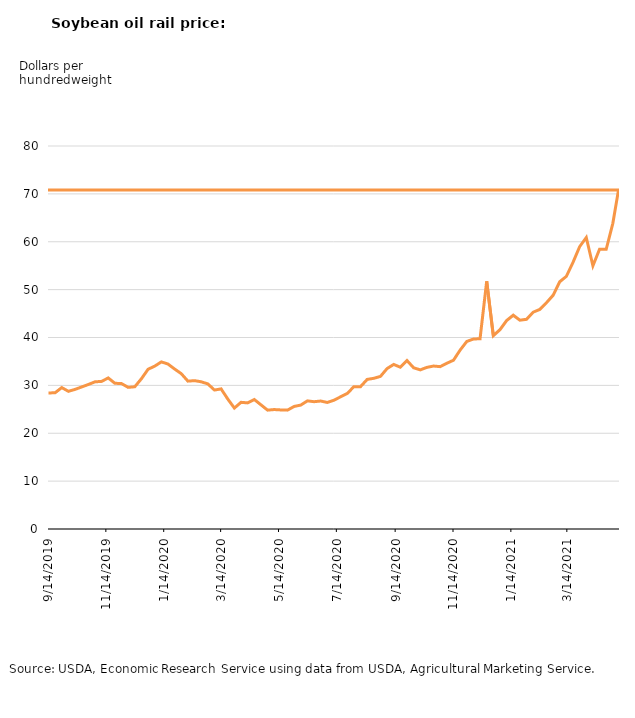
| Category | Series 0 |
|---|---|
| 9/14/19 | 28.41 |
| 9/21/19 | 28.46 |
| 9/28/19 | 29.54 |
| 10/5/19 | 28.76 |
| 10/12/19 | 29.16 |
| 10/19/19 | 29.67 |
| 10/26/19 | 30.18 |
| 11/2/19 | 30.74 |
| 11/9/19 | 30.835 |
| 11/16/19 | 31.545 |
| 11/23/19 | 30.44 |
| 11/30/19 | 30.375 |
| 12/7/19 | 29.585 |
| 12/14/19 | 29.715 |
| 12/21/19 | 31.385 |
| 12/28/19 | 33.365 |
| 1/4/20 | 34.015 |
| 1/11/20 | 34.905 |
| 1/18/20 | 34.46 |
| 1/25/20 | 33.415 |
| 2/1/20 | 32.445 |
| 2/8/20 | 30.885 |
| 2/15/20 | 30.985 |
| 2/22/20 | 30.75 |
| 2/29/20 | 30.31 |
| 3/7/20 | 29.025 |
| 3/14/20 | 29.265 |
| 3/21/20 | 27.155 |
| 3/28/20 | 25.26 |
| 4/4/20 | 26.46 |
| 4/11/20 | 26.345 |
| 4/18/20 | 27.05 |
| 4/25/20 | 25.935 |
| 5/2/20 | 24.83 |
| 5/9/20 | 24.95 |
| 5/16/20 | 24.87 |
| 5/23/20 | 24.83 |
| 5/30/20 | 25.6 |
| 6/6/20 | 25.885 |
| 6/13/20 | 26.765 |
| 6/20/20 | 26.59 |
| 6/27/20 | 26.73 |
| 7/4/20 | 26.43 |
| 7/11/20 | 26.9 |
| 7/18/20 | 27.615 |
| 7/25/20 | 28.315 |
| 8/1/20 | 29.725 |
| 8/8/20 | 29.735 |
| 8/15/20 | 31.245 |
| 8/22/20 | 31.475 |
| 8/29/20 | 31.875 |
| 9/5/20 | 33.515 |
| 9/12/20 | 34.375 |
| 9/19/20 | 33.79 |
| 9/26/20 | 35.18 |
| 10/3/20 | 33.67 |
| 10/10/20 | 33.24 |
| 10/17/20 | 33.765 |
| 10/24/20 | 34.04 |
| 10/31/20 | 33.91 |
| 11/7/20 | 34.62 |
| 11/14/20 | 35.255 |
| 11/21/20 | 37.37 |
| 11/28/20 | 39.17 |
| 12/5/20 | 39.68 |
| 12/12/20 | 39.745 |
| 12/19/20 | 51.74 |
| 12/26/20 | 40.39 |
| 1/2/21 | 41.62 |
| 1/9/21 | 43.55 |
| 1/16/21 | 44.65 |
| 1/23/21 | 43.605 |
| 1/30/21 | 43.795 |
| 2/6/21 | 45.28 |
| 2/13/21 | 45.87 |
| 2/20/21 | 47.25 |
| 2/27/21 | 48.81 |
| 3/6/21 | 51.645 |
| 3/13/21 | 52.77 |
| 3/20/21 | 55.675 |
| 3/27/21 | 58.965 |
| 4/3/21 | 60.895 |
| 4/10/21 | 54.96 |
| 4/17/21 | 58.42 |
| 4/24/21 | 58.43 |
| 5/1/21 | 63.845 |
| 5/7/21 | 70.815 |
| nan | 70.83 |